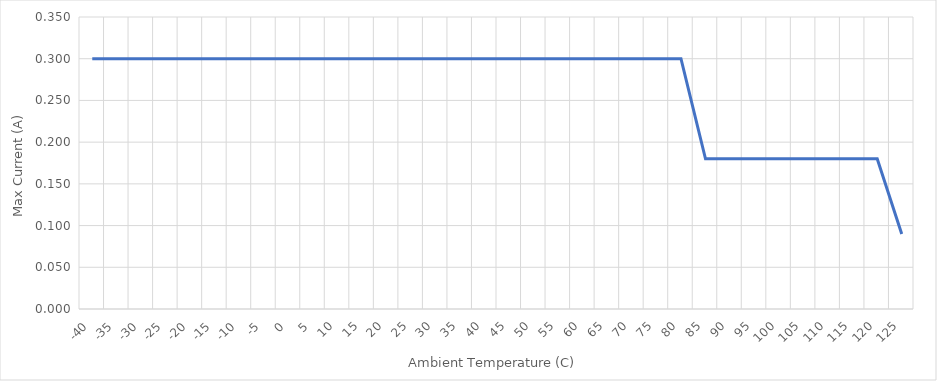
| Category | Max I (A) |
|---|---|
| -40.0 | 0.3 |
| -35.0 | 0.3 |
| -30.0 | 0.3 |
| -25.0 | 0.3 |
| -20.0 | 0.3 |
| -15.0 | 0.3 |
| -10.0 | 0.3 |
| -5.0 | 0.3 |
| 0.0 | 0.3 |
| 5.0 | 0.3 |
| 10.0 | 0.3 |
| 15.0 | 0.3 |
| 20.0 | 0.3 |
| 25.0 | 0.3 |
| 30.0 | 0.3 |
| 35.0 | 0.3 |
| 40.0 | 0.3 |
| 45.0 | 0.3 |
| 50.0 | 0.3 |
| 55.0 | 0.3 |
| 60.0 | 0.3 |
| 65.0 | 0.3 |
| 70.0 | 0.3 |
| 75.0 | 0.3 |
| 80.0 | 0.3 |
| 85.0 | 0.18 |
| 90.0 | 0.18 |
| 95.0 | 0.18 |
| 100.0 | 0.18 |
| 105.0 | 0.18 |
| 110.0 | 0.18 |
| 115.0 | 0.18 |
| 120.0 | 0.18 |
| 125.0 | 0.09 |